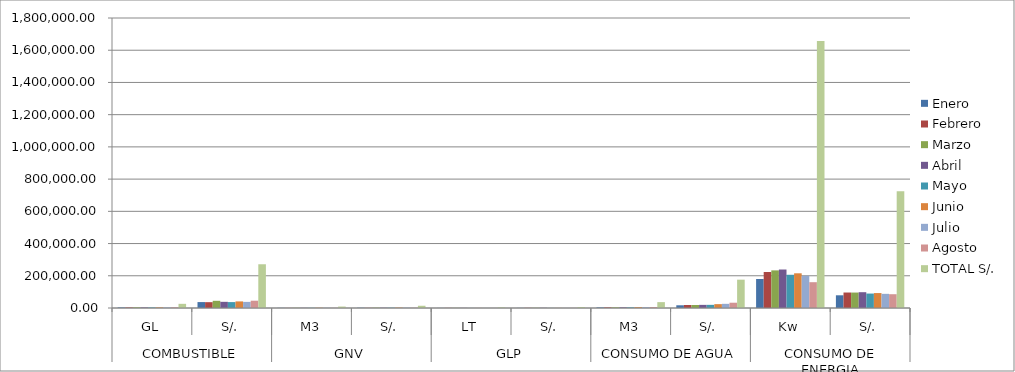
| Category | Enero | Febrero | Marzo | Abril | Mayo | Junio | Julio | Agosto | TOTAL S/. |
|---|---|---|---|---|---|---|---|---|---|
| 0 | 3559.15 | 3623.56 | 4277.46 | 3717.36 | 3481.39 | 3756.456 | 3453.39 | 4027.679 | 25868.766 |
| 1 | 36760.23 | 36175.51 | 44698.52 | 38313.23 | 36677.87 | 40938.11 | 37931.18 | 45324.32 | 271494.65 |
| 2 | 983.74 | 700.97 | 1258.85 | 1154.33 | 1238.7 | 1580.94 | 1257.76 | 802.61 | 8977.9 |
| 3 | 1553.23 | 1107.53 | 1988.98 | 1766.12 | 1895.21 | 2418.84 | 1948.72 | 1240.941 | 13919.571 |
| 4 | 465.391 | 768.785 | 915.256 | 809.786 | 282.303 | 326.396 | 281.324 | 351.158 | 4200.399 |
| 5 | 670.16 | 1107.05 | 1317.97 | 1166.09 | 406.52 | 470.01 | 405.11 | 505.67 | 6048.58 |
| 6 | 3714.32 | 4118.32 | 4126.32 | 4277 | 4186 | 5294 | 4989.32 | 5760 | 36465.28 |
| 7 | 16875.82 | 18738.21 | 18607.48 | 19409.37 | 19584.73 | 23937.85 | 25860.03 | 32805.85 | 175819.34 |
| 8 | 180008.74 | 223590.9 | 233503.3 | 238857.9 | 206203.4 | 215437 | 199718.1 | 160207.6 | 1657526.94 |
| 9 | 78844.8 | 96095.38 | 95901.52 | 98072.09 | 89628.28 | 92754.1 | 87902.12 | 85604.33 | 724802.62 |